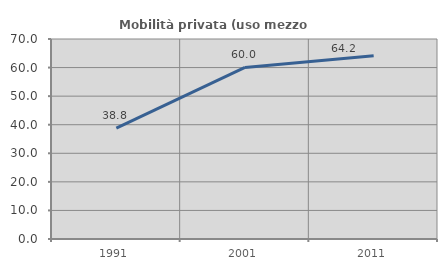
| Category | Mobilità privata (uso mezzo privato) |
|---|---|
| 1991.0 | 38.802 |
| 2001.0 | 60.047 |
| 2011.0 | 64.169 |